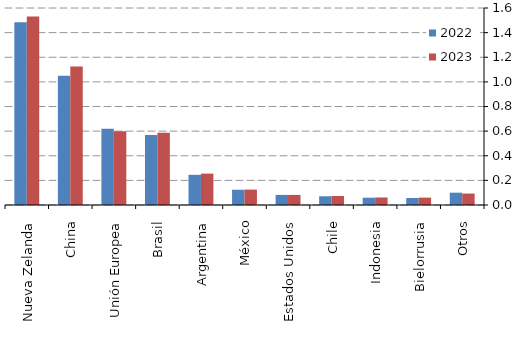
| Category | 2022 | 2023 |
|---|---|---|
| Nueva Zelanda | 1485 | 1530 |
| China | 1050 | 1125 |
| Unión Europea | 620 | 600 |
| Brasil | 568 | 586 |
| Argentina | 245 | 255 |
| México | 124 | 125 |
| Estados Unidos | 82 | 82 |
| Chile | 71 | 73 |
| Indonesia | 59 | 61 |
| Bielorrusia | 57 | 60 |
| Otros | 100 | 93 |